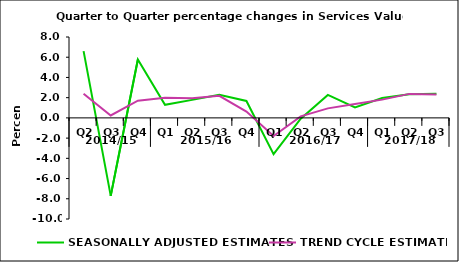
| Category | SEASONALLY ADJUSTED ESTIMATES | TREND CYCLE ESTIMATES |
|---|---|---|
| 0 | 6.608 | 2.382 |
| 1 | -7.717 | 0.238 |
| 2 | 5.773 | 1.702 |
| 3 | 1.292 | 1.991 |
| 4 | 1.783 | 1.945 |
| 5 | 2.275 | 2.177 |
| 6 | 1.671 | 0.62 |
| 7 | -3.585 | -1.79 |
| 8 | -0.073 | 0.153 |
| 9 | 2.267 | 0.942 |
| 10 | 1.042 | 1.38 |
| 11 | 1.973 | 1.807 |
| 12 | 2.328 | 2.374 |
| 13 | 2.393 | 2.311 |